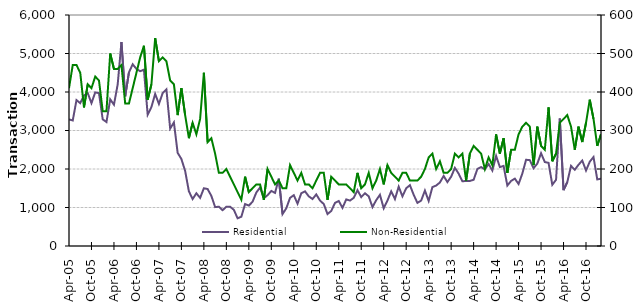
| Category | Residential |
|---|---|
| 2005-04-01 | 3290 |
| 2005-05-01 | 3260 |
| 2005-06-01 | 3790 |
| 2005-07-01 | 3710 |
| 2005-08-01 | 3910 |
| 2005-09-01 | 3970 |
| 2005-10-01 | 3710 |
| 2005-11-01 | 3990 |
| 2005-12-01 | 3970 |
| 2006-01-01 | 3290 |
| 2006-02-01 | 3220 |
| 2006-03-01 | 3810 |
| 2006-04-01 | 3670 |
| 2006-05-01 | 4200 |
| 2006-06-01 | 5300 |
| 2006-07-01 | 3890 |
| 2006-08-01 | 4510 |
| 2006-09-01 | 4720 |
| 2006-10-01 | 4600 |
| 2006-11-01 | 4540 |
| 2006-12-01 | 4580 |
| 2007-01-01 | 3410 |
| 2007-02-01 | 3610 |
| 2007-03-01 | 3950 |
| 2007-04-01 | 3690 |
| 2007-05-01 | 3970 |
| 2007-06-01 | 4070 |
| 2007-07-01 | 3050 |
| 2007-08-01 | 3210 |
| 2007-09-01 | 2420 |
| 2007-10-01 | 2260 |
| 2007-11-01 | 1950 |
| 2007-12-01 | 1420 |
| 2008-01-01 | 1220 |
| 2008-02-01 | 1370 |
| 2008-03-01 | 1250 |
| 2008-04-01 | 1500 |
| 2008-05-01 | 1480 |
| 2008-06-01 | 1300 |
| 2008-07-01 | 1010 |
| 2008-08-01 | 1020 |
| 2008-09-01 | 930 |
| 2008-10-01 | 1020 |
| 2008-11-01 | 1020 |
| 2008-12-01 | 940 |
| 2009-01-01 | 720 |
| 2009-02-01 | 760 |
| 2009-03-01 | 1090 |
| 2009-04-01 | 1050 |
| 2009-05-01 | 1150 |
| 2009-06-01 | 1390 |
| 2009-07-01 | 1520 |
| 2009-08-01 | 1240 |
| 2009-09-01 | 1320 |
| 2009-10-01 | 1430 |
| 2009-11-01 | 1380 |
| 2009-12-01 | 1750 |
| 2010-01-01 | 830 |
| 2010-02-01 | 980 |
| 2010-03-01 | 1250 |
| 2010-04-01 | 1320 |
| 2010-05-01 | 1100 |
| 2010-06-01 | 1370 |
| 2010-07-01 | 1420 |
| 2010-08-01 | 1290 |
| 2010-09-01 | 1220 |
| 2010-10-01 | 1340 |
| 2010-11-01 | 1180 |
| 2010-12-01 | 1090 |
| 2011-01-01 | 830 |
| 2011-02-01 | 910 |
| 2011-03-01 | 1120 |
| 2011-04-01 | 1170 |
| 2011-05-01 | 990 |
| 2011-06-01 | 1210 |
| 2011-07-01 | 1180 |
| 2011-08-01 | 1250 |
| 2011-09-01 | 1450 |
| 2011-10-01 | 1270 |
| 2011-11-01 | 1370 |
| 2011-12-01 | 1290 |
| 2012-01-01 | 1010 |
| 2012-02-01 | 1190 |
| 2012-03-01 | 1330 |
| 2012-04-01 | 980 |
| 2012-05-01 | 1180 |
| 2012-06-01 | 1420 |
| 2012-07-01 | 1220 |
| 2012-08-01 | 1540 |
| 2012-09-01 | 1290 |
| 2012-10-01 | 1500 |
| 2012-11-01 | 1580 |
| 2012-12-01 | 1330 |
| 2013-01-01 | 1120 |
| 2013-02-01 | 1180 |
| 2013-03-01 | 1440 |
| 2013-04-01 | 1170 |
| 2013-05-01 | 1530 |
| 2013-06-01 | 1570 |
| 2013-07-01 | 1650 |
| 2013-08-01 | 1820 |
| 2013-09-01 | 1660 |
| 2013-10-01 | 1800 |
| 2013-11-01 | 2030 |
| 2013-12-01 | 1880 |
| 2014-01-01 | 1680 |
| 2014-02-01 | 1690 |
| 2014-03-01 | 1690 |
| 2014-04-01 | 1720 |
| 2014-05-01 | 2000 |
| 2014-06-01 | 2050 |
| 2014-07-01 | 1990 |
| 2014-08-01 | 2130 |
| 2014-09-01 | 1960 |
| 2014-10-01 | 2340 |
| 2014-11-01 | 2050 |
| 2014-12-01 | 2080 |
| 2015-01-01 | 1570 |
| 2015-02-01 | 1690 |
| 2015-03-01 | 1750 |
| 2015-04-01 | 1610 |
| 2015-05-01 | 1880 |
| 2015-06-01 | 2240 |
| 2015-07-01 | 2230 |
| 2015-08-01 | 2020 |
| 2015-09-01 | 2140 |
| 2015-10-01 | 2410 |
| 2015-11-01 | 2180 |
| 2015-12-01 | 2160 |
| 2016-01-01 | 1590 |
| 2016-02-01 | 1720 |
| 2016-03-01 | 3310 |
| 2016-04-01 | 1450 |
| 2016-05-01 | 1660 |
| 2016-06-01 | 2080 |
| 2016-07-01 | 1980 |
| 2016-08-01 | 2110 |
| 2016-09-01 | 2220 |
| 2016-10-01 | 1960 |
| 2016-11-01 | 2190 |
| 2016-12-01 | 2310 |
| 2017-01-01 | 1730 |
| 2017-02-01 | 1750 |